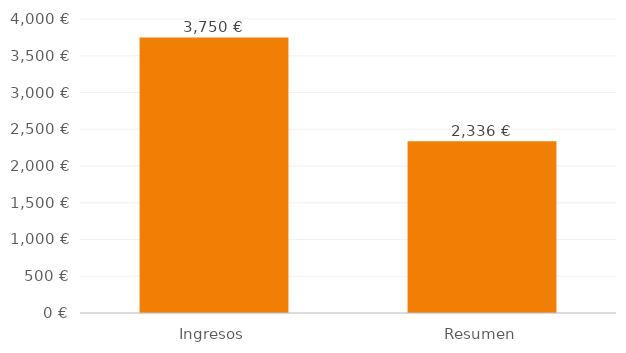
| Category | DatosGráfico |
|---|---|
| 0 | 3750 |
| 1 | 2336 |